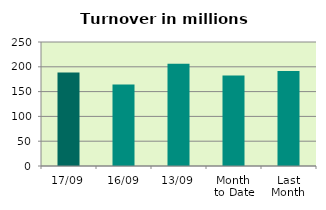
| Category | Series 0 |
|---|---|
| 17/09 | 188.377 |
| 16/09 | 164.356 |
| 13/09 | 205.968 |
| Month 
to Date | 182.686 |
| Last
Month | 191.512 |